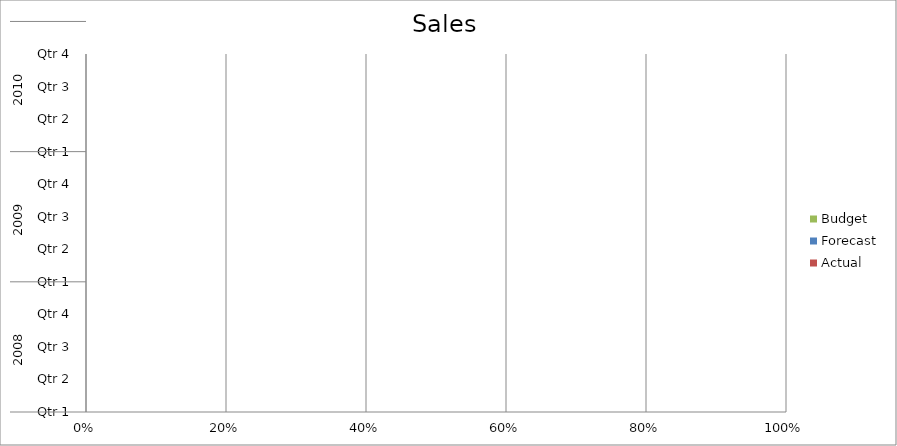
| Category | Budget | Forecast | Actual |
|---|---|---|---|
| 0 | 2390 | 560 | 1990 |
| 1 | 2320 | 2970 | 980 |
| 2 | 2280 | 660 | 1460 |
| 3 | 2890 | 1710 | 910 |
| 4 | 3180 | 1320 | 580 |
| 5 | 3020 | 3340 | 3140 |
| 6 | 2070 | 1160 | 1090 |
| 7 | 2770 | 840 | 880 |
| 8 | 3230 | 2300 | 2970 |
| 9 | 2150 | 2540 | 3190 |
| 10 | 2080 | 2170 | 1420 |
| 11 | 2200 | 2350 | 1960 |